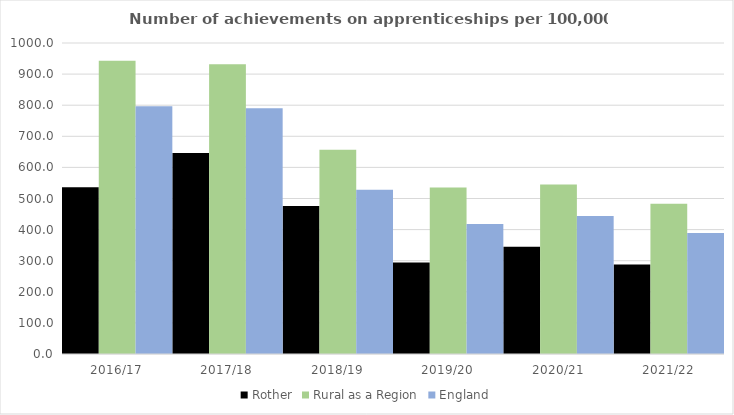
| Category | Rother | Rural as a Region | England |
|---|---|---|---|
| 2016/17 | 536 | 942.594 | 797 |
| 2017/18 | 646 | 931.709 | 790 |
| 2018/19 | 476 | 656.44 | 528 |
| 2019/20 | 294 | 535.552 | 418 |
| 2020/21 | 345 | 545.333 | 444 |
| 2021/22 | 288 | 482.936 | 389 |